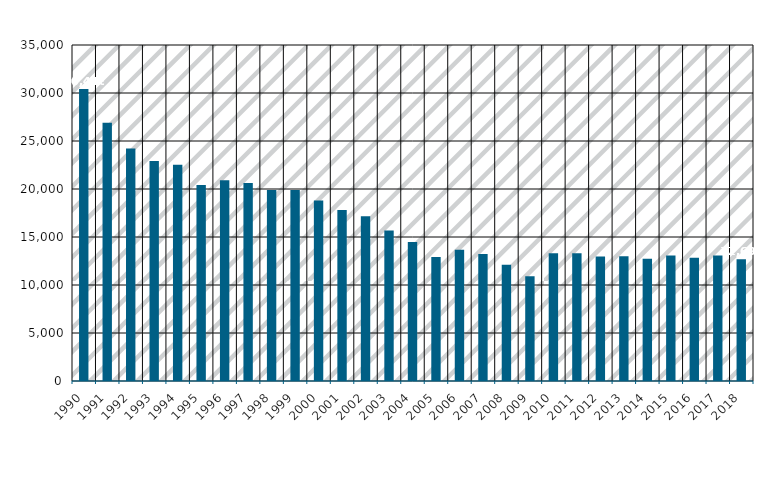
| Category | Cadmium |
|---|---|
| 1990.0 | 30416 |
| 1991.0 | 26894 |
| 1992.0 | 24214 |
| 1993.0 | 22913 |
| 1994.0 | 22516 |
| 1995.0 | 20408 |
| 1996.0 | 20899 |
| 1997.0 | 20624 |
| 1998.0 | 19885 |
| 1999.0 | 19886 |
| 2000.0 | 18803 |
| 2001.0 | 17819 |
| 2002.0 | 17167 |
| 2003.0 | 15679 |
| 2004.0 | 14480 |
| 2005.0 | 12921 |
| 2006.0 | 13674 |
| 2007.0 | 13224 |
| 2008.0 | 12115 |
| 2009.0 | 10901 |
| 2010.0 | 13309 |
| 2011.0 | 13311 |
| 2012.0 | 12960 |
| 2013.0 | 13000 |
| 2014.0 | 12738 |
| 2015.0 | 13080 |
| 2016.0 | 12838 |
| 2017.0 | 13066 |
| 2018.0 | 12692 |